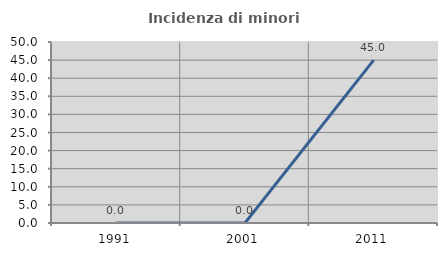
| Category | Incidenza di minori stranieri |
|---|---|
| 1991.0 | 0 |
| 2001.0 | 0 |
| 2011.0 | 45 |